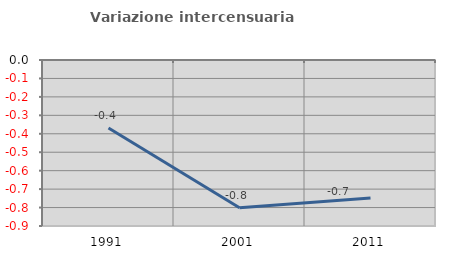
| Category | Variazione intercensuaria annua |
|---|---|
| 1991.0 | -0.368 |
| 2001.0 | -0.801 |
| 2011.0 | -0.749 |